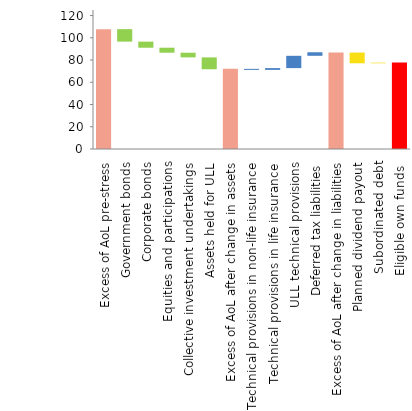
| Category | Series 0 | Series 1 |
|---|---|---|
| Excess of AoL pre-stress | 107.78 | 0 |
| Government bonds | 96.55 | 11.23 |
| Corporate bonds | 91.07 | 5.48 |
| Equities and participations | 86.59 | 4.49 |
| Collective investment undertakings | 82.4 | 4.19 |
| Assets held for ULL | 71.71 | 10.68 |
| Excess of AoL after change in assets | 0 | 72.07 |
| Technical provisions in non-life insurance | 71.15 | 0.92 |
| Technical provisions in life insurance | 71.15 | 1.61 |
| ULL technical provisions | 72.75 | 11.05 |
| Deferred tax liabilities | 83.81 | 3.19 |
| Excess of AoL after change in liabilities | 0 | 86.72 |
| Planned dividend payout | 77.09 | 9.63 |
| Subordinated debt | 77.09 | 0.56 |
| Eligible own funds  | 0 | 77.69 |